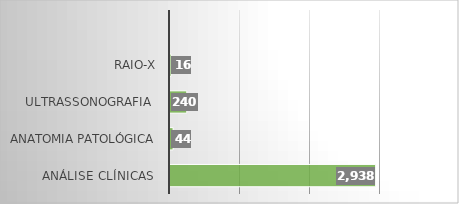
| Category | Series 0 |
|---|---|
| Análise Clínicas  | 2938 |
| Anatomia Patológica | 44 |
| Ultrassonografia  | 240 |
| RAIO-X | 16 |